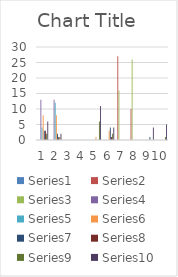
| Category | Series 0 | Series 1 | Series 2 | Series 3 | Series 4 | Series 5 | Series 6 | Series 7 | Series 8 | Series 9 |
|---|---|---|---|---|---|---|---|---|---|---|
| 0 | 0 | 0 | 0 | 13 | 4 | 8 | 3 | 3 | 2 | 6 |
| 1 | 0 | 0 | 0 | 13 | 12 | 8 | 2 | 1 | 1 | 2 |
| 2 | 0 | 0 | 0 | 0 | 0 | 0 | 0 | 0 | 0 | 0 |
| 3 | 0 | 0 | 0 | 0 | 0 | 0 | 0 | 0 | 0 | 0 |
| 4 | 0 | 0 | 0 | 0 | 0 | 1 | 0 | 0 | 6 | 11 |
| 5 | 0 | 0 | 0 | 0 | 0 | 3 | 4 | 1 | 2 | 4 |
| 6 | 0 | 27 | 16 | 0 | 0 | 0 | 0 | 0 | 0 | 0 |
| 7 | 0 | 10 | 26 | 0 | 0 | 0 | 0 | 0 | 0 | 0 |
| 8 | 0 | 0 | 0 | 0 | 0 | 0 | 1 | 0 | 0 | 4 |
| 9 | 0 | 0 | 0 | 0 | 0 | 0 | 0 | 0 | 1 | 5 |